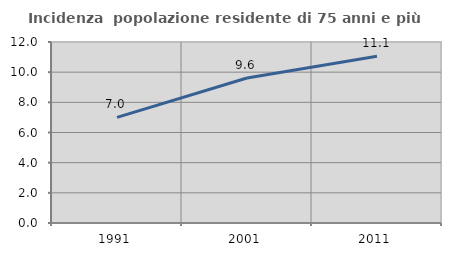
| Category | Incidenza  popolazione residente di 75 anni e più |
|---|---|
| 1991.0 | 7.001 |
| 2001.0 | 9.614 |
| 2011.0 | 11.054 |